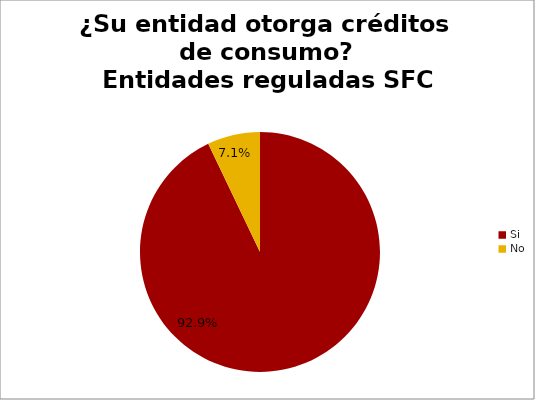
| Category | ¿Su entidad otorga créditos de consumo? Entidades reguladas SFC |
|---|---|
| Si | 0.929 |
| No | 0.071 |